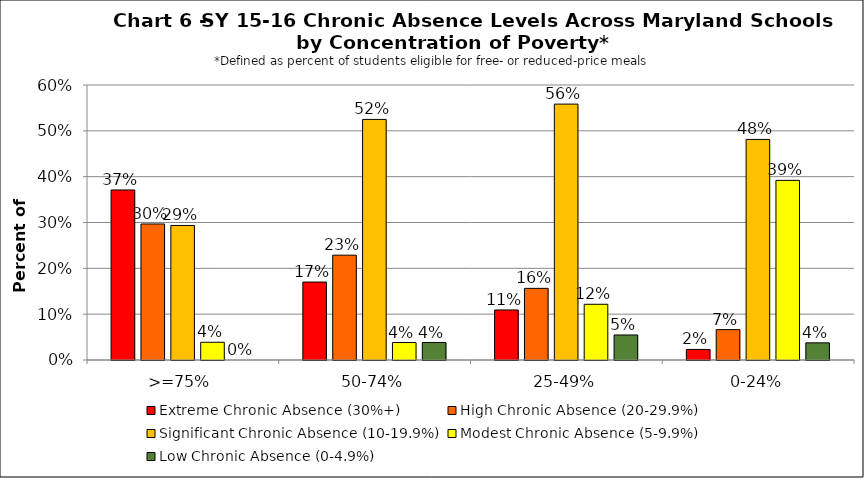
| Category | Extreme Chronic Absence (30%+) | High Chronic Absence (20-29.9%) | Significant Chronic Absence (10-19.9%) | Modest Chronic Absence (5-9.9%) | Low Chronic Absence (0-4.9%) |
|---|---|---|---|---|---|
| 0 | 0.371 | 0.297 | 0.294 | 0.039 | 0 |
| 1 | 0.17 | 0.229 | 0.525 | 0.038 | 0.038 |
| 2 | 0.109 | 0.156 | 0.558 | 0.122 | 0.055 |
| 3 | 0.023 | 0.066 | 0.481 | 0.392 | 0.037 |